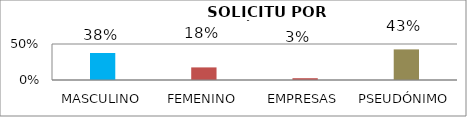
| Category | Series 1 |
|---|---|
| MASCULINO | 0.375 |
| FEMENINO | 0.175 |
| EMPRESAS | 0.025 |
| PSEUDÓNIMO | 0.425 |